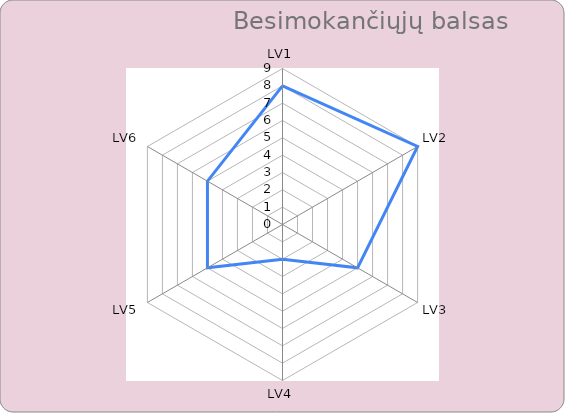
| Category | Series 0 |
|---|---|
| LV1 | 8 |
| LV2 | 9 |
| LV3 | 5 |
| LV4 | 2 |
| LV5 | 5 |
| LV6 | 5 |